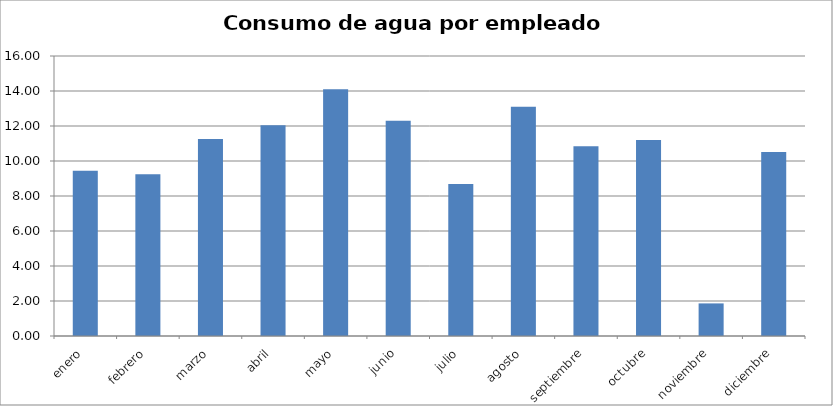
| Category | Series 0 |
|---|---|
| enero | 9.444 |
| febrero | 9.25 |
| marzo | 11.262 |
| abril | 12.038 |
| mayo | 14.1 |
| junio | 12.306 |
| julio | 8.681 |
| agosto | 13.094 |
| septiembre | 10.844 |
| octubre | 11.194 |
| noviembre | 1.862 |
| diciembre | 10.512 |